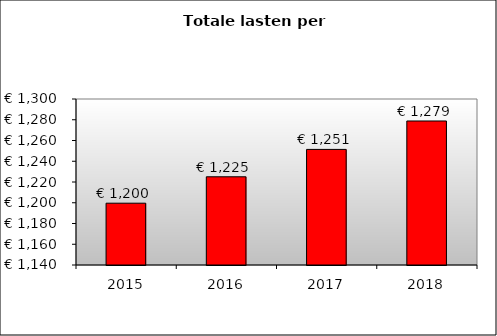
| Category | Series 0 |
|---|---|
| 2015.0 | 1199.566 |
| 2016.0 | 1225.029 |
| 2017.0 | 1251.413 |
| 2018.0 | 1278.806 |